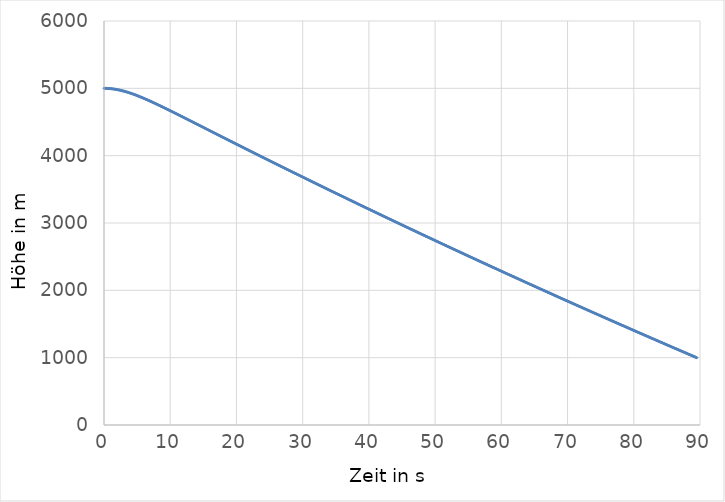
| Category | Series 0 |
|---|---|
| 0.0 | 5000 |
| 0.1 | 4999.951 |
| 0.2 | 4999.804 |
| 0.30000000000000004 | 4999.559 |
| 0.4 | 4999.216 |
| 0.5 | 4998.775 |
| 0.6 | 4998.237 |
| 0.7 | 4997.602 |
| 0.7999999999999999 | 4996.87 |
| 0.8999999999999999 | 4996.043 |
| 0.9999999999999999 | 4995.119 |
| 1.0999999999999999 | 4994.101 |
| 1.2 | 4992.989 |
| 1.3 | 4991.783 |
| 1.4000000000000001 | 4990.484 |
| 1.5000000000000002 | 4989.094 |
| 1.6000000000000003 | 4987.613 |
| 1.7000000000000004 | 4986.042 |
| 1.8000000000000005 | 4984.382 |
| 1.9000000000000006 | 4982.634 |
| 2.0000000000000004 | 4980.8 |
| 2.1000000000000005 | 4978.88 |
| 2.2000000000000006 | 4976.876 |
| 2.3000000000000007 | 4974.788 |
| 2.400000000000001 | 4972.619 |
| 2.500000000000001 | 4970.37 |
| 2.600000000000001 | 4968.041 |
| 2.700000000000001 | 4965.635 |
| 2.800000000000001 | 4963.152 |
| 2.9000000000000012 | 4960.594 |
| 3.0000000000000013 | 4957.962 |
| 3.1000000000000014 | 4955.259 |
| 3.2000000000000015 | 4952.484 |
| 3.3000000000000016 | 4949.641 |
| 3.4000000000000017 | 4946.729 |
| 3.5000000000000018 | 4943.752 |
| 3.600000000000002 | 4940.709 |
| 3.700000000000002 | 4937.604 |
| 3.800000000000002 | 4934.436 |
| 3.900000000000002 | 4931.208 |
| 4.000000000000002 | 4927.921 |
| 4.100000000000001 | 4924.576 |
| 4.200000000000001 | 4921.176 |
| 4.300000000000001 | 4917.721 |
| 4.4 | 4914.213 |
| 4.5 | 4910.652 |
| 4.6 | 4907.042 |
| 4.699999999999999 | 4903.383 |
| 4.799999999999999 | 4899.675 |
| 4.899999999999999 | 4895.922 |
| 4.999999999999998 | 4892.124 |
| 5.099999999999998 | 4888.282 |
| 5.1999999999999975 | 4884.397 |
| 5.299999999999997 | 4880.472 |
| 5.399999999999997 | 4876.506 |
| 5.4999999999999964 | 4872.502 |
| 5.599999999999996 | 4868.461 |
| 5.699999999999996 | 4864.383 |
| 5.799999999999995 | 4860.27 |
| 5.899999999999995 | 4856.122 |
| 5.999999999999995 | 4851.942 |
| 6.099999999999994 | 4847.73 |
| 6.199999999999994 | 4843.487 |
| 6.299999999999994 | 4839.214 |
| 6.399999999999993 | 4834.912 |
| 6.499999999999993 | 4830.583 |
| 6.5999999999999925 | 4826.226 |
| 6.699999999999992 | 4821.844 |
| 6.799999999999992 | 4817.436 |
| 6.8999999999999915 | 4813.004 |
| 6.999999999999991 | 4808.548 |
| 7.099999999999991 | 4804.07 |
| 7.19999999999999 | 4799.571 |
| 7.29999999999999 | 4795.05 |
| 7.39999999999999 | 4790.509 |
| 7.499999999999989 | 4785.948 |
| 7.599999999999989 | 4781.369 |
| 7.699999999999989 | 4776.771 |
| 7.799999999999988 | 4772.157 |
| 7.899999999999988 | 4767.525 |
| 7.999999999999988 | 4762.877 |
| 8.099999999999987 | 4758.214 |
| 8.199999999999987 | 4753.535 |
| 8.299999999999986 | 4748.842 |
| 8.399999999999986 | 4744.136 |
| 8.499999999999986 | 4739.416 |
| 8.599999999999985 | 4734.683 |
| 8.699999999999985 | 4729.938 |
| 8.799999999999985 | 4725.182 |
| 8.899999999999984 | 4720.414 |
| 8.999999999999984 | 4715.635 |
| 9.099999999999984 | 4710.845 |
| 9.199999999999983 | 4706.046 |
| 9.299999999999983 | 4701.237 |
| 9.399999999999983 | 4696.419 |
| 9.499999999999982 | 4691.592 |
| 9.599999999999982 | 4686.757 |
| 9.699999999999982 | 4681.914 |
| 9.799999999999981 | 4677.063 |
| 9.89999999999998 | 4672.204 |
| 9.99999999999998 | 4667.338 |
| 10.09999999999998 | 4662.466 |
| 10.19999999999998 | 4657.587 |
| 10.29999999999998 | 4652.702 |
| 10.399999999999979 | 4647.811 |
| 10.499999999999979 | 4642.915 |
| 10.599999999999978 | 4638.013 |
| 10.699999999999978 | 4633.106 |
| 10.799999999999978 | 4628.194 |
| 10.899999999999977 | 4623.277 |
| 10.999999999999977 | 4618.356 |
| 11.099999999999977 | 4613.431 |
| 11.199999999999976 | 4608.502 |
| 11.299999999999976 | 4603.569 |
| 11.399999999999975 | 4598.632 |
| 11.499999999999975 | 4593.692 |
| 11.599999999999975 | 4588.749 |
| 11.699999999999974 | 4583.802 |
| 11.799999999999974 | 4578.853 |
| 11.899999999999974 | 4573.901 |
| 11.999999999999973 | 4568.946 |
| 12.099999999999973 | 4563.989 |
| 12.199999999999973 | 4559.029 |
| 12.299999999999972 | 4554.068 |
| 12.399999999999972 | 4549.104 |
| 12.499999999999972 | 4544.138 |
| 12.599999999999971 | 4539.171 |
| 12.69999999999997 | 4534.202 |
| 12.79999999999997 | 4529.231 |
| 12.89999999999997 | 4524.259 |
| 12.99999999999997 | 4519.286 |
| 13.09999999999997 | 4514.311 |
| 13.199999999999969 | 4509.335 |
| 13.299999999999969 | 4504.358 |
| 13.399999999999968 | 4499.38 |
| 13.499999999999968 | 4494.401 |
| 13.599999999999968 | 4489.422 |
| 13.699999999999967 | 4484.442 |
| 13.799999999999967 | 4479.461 |
| 13.899999999999967 | 4474.479 |
| 13.999999999999966 | 4469.497 |
| 14.099999999999966 | 4464.515 |
| 14.199999999999966 | 4459.532 |
| 14.299999999999965 | 4454.549 |
| 14.399999999999965 | 4449.565 |
| 14.499999999999964 | 4444.582 |
| 14.599999999999964 | 4439.598 |
| 14.699999999999964 | 4434.614 |
| 14.799999999999963 | 4429.631 |
| 14.899999999999963 | 4424.647 |
| 14.999999999999963 | 4419.663 |
| 15.099999999999962 | 4414.68 |
| 15.199999999999962 | 4409.696 |
| 15.299999999999962 | 4404.713 |
| 15.399999999999961 | 4399.73 |
| 15.499999999999961 | 4394.747 |
| 15.59999999999996 | 4389.765 |
| 15.69999999999996 | 4384.783 |
| 15.79999999999996 | 4379.802 |
| 15.89999999999996 | 4374.82 |
| 15.99999999999996 | 4369.84 |
| 16.09999999999996 | 4364.86 |
| 16.19999999999996 | 4359.88 |
| 16.29999999999996 | 4354.901 |
| 16.399999999999963 | 4349.922 |
| 16.499999999999964 | 4344.944 |
| 16.599999999999966 | 4339.967 |
| 16.699999999999967 | 4334.99 |
| 16.79999999999997 | 4330.015 |
| 16.89999999999997 | 4325.039 |
| 16.99999999999997 | 4320.065 |
| 17.099999999999973 | 4315.091 |
| 17.199999999999974 | 4310.118 |
| 17.299999999999976 | 4305.146 |
| 17.399999999999977 | 4300.174 |
| 17.49999999999998 | 4295.203 |
| 17.59999999999998 | 4290.234 |
| 17.69999999999998 | 4285.265 |
| 17.799999999999983 | 4280.297 |
| 17.899999999999984 | 4275.329 |
| 17.999999999999986 | 4270.363 |
| 18.099999999999987 | 4265.398 |
| 18.19999999999999 | 4260.433 |
| 18.29999999999999 | 4255.47 |
| 18.39999999999999 | 4250.507 |
| 18.499999999999993 | 4245.545 |
| 18.599999999999994 | 4240.585 |
| 18.699999999999996 | 4235.625 |
| 18.799999999999997 | 4230.666 |
| 18.9 | 4225.708 |
| 19.0 | 4220.752 |
| 19.1 | 4215.796 |
| 19.200000000000003 | 4210.841 |
| 19.300000000000004 | 4205.887 |
| 19.400000000000006 | 4200.935 |
| 19.500000000000007 | 4195.983 |
| 19.60000000000001 | 4191.033 |
| 19.70000000000001 | 4186.083 |
| 19.80000000000001 | 4181.135 |
| 19.900000000000013 | 4176.187 |
| 20.000000000000014 | 4171.241 |
| 20.100000000000016 | 4166.296 |
| 20.200000000000017 | 4161.352 |
| 20.30000000000002 | 4156.409 |
| 20.40000000000002 | 4151.467 |
| 20.50000000000002 | 4146.526 |
| 20.600000000000023 | 4141.587 |
| 20.700000000000024 | 4136.648 |
| 20.800000000000026 | 4131.711 |
| 20.900000000000027 | 4126.774 |
| 21.00000000000003 | 4121.839 |
| 21.10000000000003 | 4116.905 |
| 21.20000000000003 | 4111.972 |
| 21.300000000000033 | 4107.04 |
| 21.400000000000034 | 4102.11 |
| 21.500000000000036 | 4097.18 |
| 21.600000000000037 | 4092.252 |
| 21.70000000000004 | 4087.325 |
| 21.80000000000004 | 4082.399 |
| 21.90000000000004 | 4077.474 |
| 22.000000000000043 | 4072.55 |
| 22.100000000000044 | 4067.628 |
| 22.200000000000045 | 4062.706 |
| 22.300000000000047 | 4057.786 |
| 22.40000000000005 | 4052.867 |
| 22.50000000000005 | 4047.949 |
| 22.60000000000005 | 4043.032 |
| 22.700000000000053 | 4038.117 |
| 22.800000000000054 | 4033.202 |
| 22.900000000000055 | 4028.289 |
| 23.000000000000057 | 4023.377 |
| 23.10000000000006 | 4018.466 |
| 23.20000000000006 | 4013.556 |
| 23.30000000000006 | 4008.648 |
| 23.400000000000063 | 4003.74 |
| 23.500000000000064 | 3998.834 |
| 23.600000000000065 | 3993.929 |
| 23.700000000000067 | 3989.026 |
| 23.800000000000068 | 3984.123 |
| 23.90000000000007 | 3979.221 |
| 24.00000000000007 | 3974.321 |
| 24.100000000000072 | 3969.422 |
| 24.200000000000074 | 3964.524 |
| 24.300000000000075 | 3959.628 |
| 24.400000000000077 | 3954.732 |
| 24.500000000000078 | 3949.838 |
| 24.60000000000008 | 3944.945 |
| 24.70000000000008 | 3940.053 |
| 24.800000000000082 | 3935.162 |
| 24.900000000000084 | 3930.272 |
| 25.000000000000085 | 3925.384 |
| 25.100000000000087 | 3920.497 |
| 25.200000000000088 | 3915.611 |
| 25.30000000000009 | 3910.726 |
| 25.40000000000009 | 3905.842 |
| 25.500000000000092 | 3900.96 |
| 25.600000000000094 | 3896.079 |
| 25.700000000000095 | 3891.199 |
| 25.800000000000097 | 3886.32 |
| 25.900000000000098 | 3881.442 |
| 26.0000000000001 | 3876.566 |
| 26.1000000000001 | 3871.69 |
| 26.200000000000102 | 3866.816 |
| 26.300000000000104 | 3861.943 |
| 26.400000000000105 | 3857.072 |
| 26.500000000000107 | 3852.201 |
| 26.600000000000108 | 3847.332 |
| 26.70000000000011 | 3842.464 |
| 26.80000000000011 | 3837.597 |
| 26.900000000000112 | 3832.731 |
| 27.000000000000114 | 3827.866 |
| 27.100000000000115 | 3823.003 |
| 27.200000000000117 | 3818.141 |
| 27.300000000000118 | 3813.28 |
| 27.40000000000012 | 3808.42 |
| 27.50000000000012 | 3803.561 |
| 27.600000000000122 | 3798.704 |
| 27.700000000000124 | 3793.848 |
| 27.800000000000125 | 3788.993 |
| 27.900000000000126 | 3784.139 |
| 28.000000000000128 | 3779.286 |
| 28.10000000000013 | 3774.434 |
| 28.20000000000013 | 3769.584 |
| 28.300000000000132 | 3764.735 |
| 28.400000000000134 | 3759.887 |
| 28.500000000000135 | 3755.04 |
| 28.600000000000136 | 3750.195 |
| 28.700000000000138 | 3745.35 |
| 28.80000000000014 | 3740.507 |
| 28.90000000000014 | 3735.665 |
| 29.000000000000142 | 3730.824 |
| 29.100000000000144 | 3725.984 |
| 29.200000000000145 | 3721.146 |
| 29.300000000000146 | 3716.309 |
| 29.400000000000148 | 3711.472 |
| 29.50000000000015 | 3706.638 |
| 29.60000000000015 | 3701.804 |
| 29.700000000000152 | 3696.971 |
| 29.800000000000153 | 3692.14 |
| 29.900000000000155 | 3687.309 |
| 30.000000000000156 | 3682.48 |
| 30.100000000000158 | 3677.653 |
| 30.20000000000016 | 3672.826 |
| 30.30000000000016 | 3668 |
| 30.400000000000162 | 3663.176 |
| 30.500000000000163 | 3658.353 |
| 30.600000000000165 | 3653.531 |
| 30.700000000000166 | 3648.71 |
| 30.800000000000168 | 3643.89 |
| 30.90000000000017 | 3639.072 |
| 31.00000000000017 | 3634.254 |
| 31.100000000000172 | 3629.438 |
| 31.200000000000173 | 3624.623 |
| 31.300000000000175 | 3619.81 |
| 31.400000000000176 | 3614.997 |
| 31.500000000000178 | 3610.186 |
| 31.60000000000018 | 3605.375 |
| 31.70000000000018 | 3600.566 |
| 31.800000000000182 | 3595.758 |
| 31.900000000000183 | 3590.951 |
| 32.000000000000185 | 3586.146 |
| 32.100000000000186 | 3581.341 |
| 32.20000000000019 | 3576.538 |
| 32.30000000000019 | 3571.736 |
| 32.40000000000019 | 3566.935 |
| 32.50000000000019 | 3562.135 |
| 32.60000000000019 | 3557.337 |
| 32.700000000000195 | 3552.539 |
| 32.800000000000196 | 3547.743 |
| 32.9000000000002 | 3542.948 |
| 33.0000000000002 | 3538.154 |
| 33.1000000000002 | 3533.361 |
| 33.2000000000002 | 3528.569 |
| 33.3000000000002 | 3523.779 |
| 33.400000000000205 | 3518.99 |
| 33.500000000000206 | 3514.201 |
| 33.60000000000021 | 3509.414 |
| 33.70000000000021 | 3504.629 |
| 33.80000000000021 | 3499.844 |
| 33.90000000000021 | 3495.06 |
| 34.00000000000021 | 3490.278 |
| 34.100000000000215 | 3485.497 |
| 34.200000000000216 | 3480.717 |
| 34.30000000000022 | 3475.938 |
| 34.40000000000022 | 3471.16 |
| 34.50000000000022 | 3466.383 |
| 34.60000000000022 | 3461.608 |
| 34.70000000000022 | 3456.834 |
| 34.800000000000225 | 3452.061 |
| 34.900000000000226 | 3447.289 |
| 35.00000000000023 | 3442.518 |
| 35.10000000000023 | 3437.748 |
| 35.20000000000023 | 3432.98 |
| 35.30000000000023 | 3428.212 |
| 35.40000000000023 | 3423.446 |
| 35.500000000000234 | 3418.681 |
| 35.600000000000236 | 3413.917 |
| 35.70000000000024 | 3409.154 |
| 35.80000000000024 | 3404.393 |
| 35.90000000000024 | 3399.632 |
| 36.00000000000024 | 3394.873 |
| 36.10000000000024 | 3390.115 |
| 36.200000000000244 | 3385.358 |
| 36.300000000000246 | 3380.602 |
| 36.40000000000025 | 3375.847 |
| 36.50000000000025 | 3371.093 |
| 36.60000000000025 | 3366.341 |
| 36.70000000000025 | 3361.589 |
| 36.80000000000025 | 3356.839 |
| 36.900000000000254 | 3352.09 |
| 37.000000000000256 | 3347.342 |
| 37.10000000000026 | 3342.595 |
| 37.20000000000026 | 3337.85 |
| 37.30000000000026 | 3333.105 |
| 37.40000000000026 | 3328.362 |
| 37.50000000000026 | 3323.62 |
| 37.600000000000264 | 3318.879 |
| 37.700000000000266 | 3314.139 |
| 37.80000000000027 | 3309.4 |
| 37.90000000000027 | 3304.662 |
| 38.00000000000027 | 3299.926 |
| 38.10000000000027 | 3295.19 |
| 38.20000000000027 | 3290.456 |
| 38.300000000000274 | 3285.723 |
| 38.400000000000276 | 3280.991 |
| 38.50000000000028 | 3276.26 |
| 38.60000000000028 | 3271.53 |
| 38.70000000000028 | 3266.802 |
| 38.80000000000028 | 3262.074 |
| 38.90000000000028 | 3257.348 |
| 39.000000000000284 | 3252.623 |
| 39.100000000000286 | 3247.899 |
| 39.20000000000029 | 3243.176 |
| 39.30000000000029 | 3238.454 |
| 39.40000000000029 | 3233.733 |
| 39.50000000000029 | 3229.013 |
| 39.60000000000029 | 3224.295 |
| 39.700000000000294 | 3219.578 |
| 39.800000000000296 | 3214.862 |
| 39.9000000000003 | 3210.146 |
| 40.0000000000003 | 3205.432 |
| 40.1000000000003 | 3200.72 |
| 40.2000000000003 | 3196.008 |
| 40.3000000000003 | 3191.297 |
| 40.400000000000304 | 3186.588 |
| 40.500000000000306 | 3181.88 |
| 40.60000000000031 | 3177.172 |
| 40.70000000000031 | 3172.466 |
| 40.80000000000031 | 3167.761 |
| 40.90000000000031 | 3163.057 |
| 41.00000000000031 | 3158.355 |
| 41.100000000000314 | 3153.653 |
| 41.200000000000315 | 3148.953 |
| 41.30000000000032 | 3144.253 |
| 41.40000000000032 | 3139.555 |
| 41.50000000000032 | 3134.858 |
| 41.60000000000032 | 3130.162 |
| 41.70000000000032 | 3125.467 |
| 41.800000000000324 | 3120.773 |
| 41.900000000000325 | 3116.08 |
| 42.00000000000033 | 3111.389 |
| 42.10000000000033 | 3106.698 |
| 42.20000000000033 | 3102.009 |
| 42.30000000000033 | 3097.321 |
| 42.40000000000033 | 3092.633 |
| 42.500000000000334 | 3087.947 |
| 42.600000000000335 | 3083.263 |
| 42.70000000000034 | 3078.579 |
| 42.80000000000034 | 3073.896 |
| 42.90000000000034 | 3069.214 |
| 43.00000000000034 | 3064.534 |
| 43.10000000000034 | 3059.855 |
| 43.200000000000344 | 3055.176 |
| 43.300000000000345 | 3050.499 |
| 43.40000000000035 | 3045.823 |
| 43.50000000000035 | 3041.148 |
| 43.60000000000035 | 3036.474 |
| 43.70000000000035 | 3031.802 |
| 43.80000000000035 | 3027.13 |
| 43.900000000000354 | 3022.46 |
| 44.000000000000355 | 3017.79 |
| 44.10000000000036 | 3013.122 |
| 44.20000000000036 | 3008.455 |
| 44.30000000000036 | 3003.788 |
| 44.40000000000036 | 2999.123 |
| 44.50000000000036 | 2994.459 |
| 44.600000000000364 | 2989.797 |
| 44.700000000000365 | 2985.135 |
| 44.80000000000037 | 2980.474 |
| 44.90000000000037 | 2975.815 |
| 45.00000000000037 | 2971.156 |
| 45.10000000000037 | 2966.499 |
| 45.20000000000037 | 2961.843 |
| 45.300000000000374 | 2957.188 |
| 45.400000000000375 | 2952.534 |
| 45.50000000000038 | 2947.881 |
| 45.60000000000038 | 2943.229 |
| 45.70000000000038 | 2938.578 |
| 45.80000000000038 | 2933.928 |
| 45.90000000000038 | 2929.28 |
| 46.000000000000384 | 2924.632 |
| 46.100000000000385 | 2919.986 |
| 46.20000000000039 | 2915.341 |
| 46.30000000000039 | 2910.697 |
| 46.40000000000039 | 2906.053 |
| 46.50000000000039 | 2901.411 |
| 46.60000000000039 | 2896.77 |
| 46.700000000000394 | 2892.131 |
| 46.800000000000395 | 2887.492 |
| 46.9000000000004 | 2882.854 |
| 47.0000000000004 | 2878.218 |
| 47.1000000000004 | 2873.582 |
| 47.2000000000004 | 2868.948 |
| 47.3000000000004 | 2864.314 |
| 47.400000000000404 | 2859.682 |
| 47.500000000000405 | 2855.051 |
| 47.600000000000406 | 2850.421 |
| 47.70000000000041 | 2845.792 |
| 47.80000000000041 | 2841.164 |
| 47.90000000000041 | 2836.537 |
| 48.00000000000041 | 2831.911 |
| 48.10000000000041 | 2827.287 |
| 48.200000000000415 | 2822.663 |
| 48.300000000000416 | 2818.041 |
| 48.40000000000042 | 2813.419 |
| 48.50000000000042 | 2808.799 |
| 48.60000000000042 | 2804.18 |
| 48.70000000000042 | 2799.562 |
| 48.80000000000042 | 2794.944 |
| 48.900000000000425 | 2790.328 |
| 49.000000000000426 | 2785.713 |
| 49.10000000000043 | 2781.1 |
| 49.20000000000043 | 2776.487 |
| 49.30000000000043 | 2771.875 |
| 49.40000000000043 | 2767.264 |
| 49.50000000000043 | 2762.655 |
| 49.600000000000435 | 2758.046 |
| 49.700000000000436 | 2753.439 |
| 49.80000000000044 | 2748.833 |
| 49.90000000000044 | 2744.227 |
| 50.00000000000044 | 2739.623 |
| 50.10000000000044 | 2735.02 |
| 50.20000000000044 | 2730.418 |
| 50.300000000000445 | 2725.817 |
| 50.400000000000446 | 2721.217 |
| 50.50000000000045 | 2716.618 |
| 50.60000000000045 | 2712.02 |
| 50.70000000000045 | 2707.424 |
| 50.80000000000045 | 2702.828 |
| 50.90000000000045 | 2698.233 |
| 51.000000000000455 | 2693.64 |
| 51.100000000000456 | 2689.047 |
| 51.20000000000046 | 2684.456 |
| 51.30000000000046 | 2679.866 |
| 51.40000000000046 | 2675.277 |
| 51.50000000000046 | 2670.688 |
| 51.60000000000046 | 2666.101 |
| 51.700000000000465 | 2661.515 |
| 51.800000000000466 | 2656.93 |
| 51.90000000000047 | 2652.346 |
| 52.00000000000047 | 2647.763 |
| 52.10000000000047 | 2643.182 |
| 52.20000000000047 | 2638.601 |
| 52.30000000000047 | 2634.021 |
| 52.400000000000475 | 2629.442 |
| 52.500000000000476 | 2624.865 |
| 52.60000000000048 | 2620.288 |
| 52.70000000000048 | 2615.713 |
| 52.80000000000048 | 2611.139 |
| 52.90000000000048 | 2606.565 |
| 53.00000000000048 | 2601.993 |
| 53.100000000000485 | 2597.422 |
| 53.200000000000486 | 2592.852 |
| 53.30000000000049 | 2588.282 |
| 53.40000000000049 | 2583.714 |
| 53.50000000000049 | 2579.147 |
| 53.60000000000049 | 2574.581 |
| 53.70000000000049 | 2570.017 |
| 53.800000000000495 | 2565.453 |
| 53.900000000000496 | 2560.89 |
| 54.0000000000005 | 2556.328 |
| 54.1000000000005 | 2551.767 |
| 54.2000000000005 | 2547.208 |
| 54.3000000000005 | 2542.649 |
| 54.4000000000005 | 2538.092 |
| 54.500000000000504 | 2533.535 |
| 54.600000000000506 | 2528.98 |
| 54.70000000000051 | 2524.425 |
| 54.80000000000051 | 2519.872 |
| 54.90000000000051 | 2515.32 |
| 55.00000000000051 | 2510.769 |
| 55.10000000000051 | 2506.218 |
| 55.200000000000514 | 2501.669 |
| 55.300000000000516 | 2497.121 |
| 55.40000000000052 | 2492.574 |
| 55.50000000000052 | 2488.028 |
| 55.60000000000052 | 2483.483 |
| 55.70000000000052 | 2478.939 |
| 55.80000000000052 | 2474.396 |
| 55.900000000000524 | 2469.854 |
| 56.000000000000526 | 2465.314 |
| 56.10000000000053 | 2460.774 |
| 56.20000000000053 | 2456.235 |
| 56.30000000000053 | 2451.697 |
| 56.40000000000053 | 2447.161 |
| 56.50000000000053 | 2442.625 |
| 56.600000000000534 | 2438.091 |
| 56.700000000000536 | 2433.557 |
| 56.80000000000054 | 2429.025 |
| 56.90000000000054 | 2424.493 |
| 57.00000000000054 | 2419.963 |
| 57.10000000000054 | 2415.433 |
| 57.20000000000054 | 2410.905 |
| 57.300000000000544 | 2406.378 |
| 57.400000000000546 | 2401.851 |
| 57.50000000000055 | 2397.326 |
| 57.60000000000055 | 2392.802 |
| 57.70000000000055 | 2388.279 |
| 57.80000000000055 | 2383.757 |
| 57.90000000000055 | 2379.236 |
| 58.000000000000554 | 2374.716 |
| 58.100000000000556 | 2370.197 |
| 58.20000000000056 | 2365.679 |
| 58.30000000000056 | 2361.162 |
| 58.40000000000056 | 2356.646 |
| 58.50000000000056 | 2352.131 |
| 58.60000000000056 | 2347.617 |
| 58.700000000000564 | 2343.104 |
| 58.800000000000566 | 2338.592 |
| 58.90000000000057 | 2334.082 |
| 59.00000000000057 | 2329.572 |
| 59.10000000000057 | 2325.063 |
| 59.20000000000057 | 2320.555 |
| 59.30000000000057 | 2316.049 |
| 59.400000000000574 | 2311.543 |
| 59.500000000000576 | 2307.038 |
| 59.60000000000058 | 2302.535 |
| 59.70000000000058 | 2298.032 |
| 59.80000000000058 | 2293.531 |
| 59.90000000000058 | 2289.03 |
| 60.00000000000058 | 2284.531 |
| 60.100000000000584 | 2280.032 |
| 60.200000000000585 | 2275.535 |
| 60.30000000000059 | 2271.038 |
| 60.40000000000059 | 2266.543 |
| 60.50000000000059 | 2262.048 |
| 60.60000000000059 | 2257.555 |
| 60.70000000000059 | 2253.063 |
| 60.800000000000594 | 2248.571 |
| 60.900000000000595 | 2244.081 |
| 61.0000000000006 | 2239.592 |
| 61.1000000000006 | 2235.103 |
| 61.2000000000006 | 2230.616 |
| 61.3000000000006 | 2226.13 |
| 61.4000000000006 | 2221.645 |
| 61.500000000000604 | 2217.161 |
| 61.600000000000605 | 2212.677 |
| 61.70000000000061 | 2208.195 |
| 61.80000000000061 | 2203.714 |
| 61.90000000000061 | 2199.234 |
| 62.00000000000061 | 2194.755 |
| 62.10000000000061 | 2190.277 |
| 62.200000000000614 | 2185.799 |
| 62.300000000000615 | 2181.323 |
| 62.40000000000062 | 2176.848 |
| 62.50000000000062 | 2172.374 |
| 62.60000000000062 | 2167.901 |
| 62.70000000000062 | 2163.429 |
| 62.80000000000062 | 2158.958 |
| 62.900000000000624 | 2154.488 |
| 63.000000000000625 | 2150.019 |
| 63.10000000000063 | 2145.551 |
| 63.20000000000063 | 2141.084 |
| 63.30000000000063 | 2136.618 |
| 63.40000000000063 | 2132.153 |
| 63.50000000000063 | 2127.689 |
| 63.600000000000634 | 2123.226 |
| 63.700000000000635 | 2118.764 |
| 63.80000000000064 | 2114.303 |
| 63.90000000000064 | 2109.843 |
| 64.00000000000064 | 2105.384 |
| 64.10000000000063 | 2100.926 |
| 64.20000000000063 | 2096.469 |
| 64.30000000000062 | 2092.013 |
| 64.40000000000062 | 2087.558 |
| 64.50000000000061 | 2083.104 |
| 64.6000000000006 | 2078.651 |
| 64.7000000000006 | 2074.199 |
| 64.8000000000006 | 2069.749 |
| 64.90000000000059 | 2065.299 |
| 65.00000000000058 | 2060.85 |
| 65.10000000000058 | 2056.402 |
| 65.20000000000057 | 2051.955 |
| 65.30000000000057 | 2047.509 |
| 65.40000000000056 | 2043.064 |
| 65.50000000000055 | 2038.62 |
| 65.60000000000055 | 2034.177 |
| 65.70000000000054 | 2029.735 |
| 65.80000000000054 | 2025.294 |
| 65.90000000000053 | 2020.854 |
| 66.00000000000053 | 2016.415 |
| 66.10000000000052 | 2011.977 |
| 66.20000000000051 | 2007.54 |
| 66.30000000000051 | 2003.104 |
| 66.4000000000005 | 1998.669 |
| 66.5000000000005 | 1994.235 |
| 66.60000000000049 | 1989.802 |
| 66.70000000000049 | 1985.37 |
| 66.80000000000048 | 1980.939 |
| 66.90000000000047 | 1976.509 |
| 67.00000000000047 | 1972.08 |
| 67.10000000000046 | 1967.652 |
| 67.20000000000046 | 1963.225 |
| 67.30000000000045 | 1958.799 |
| 67.40000000000045 | 1954.374 |
| 67.50000000000044 | 1949.95 |
| 67.60000000000043 | 1945.527 |
| 67.70000000000043 | 1941.105 |
| 67.80000000000042 | 1936.684 |
| 67.90000000000042 | 1932.263 |
| 68.00000000000041 | 1927.844 |
| 68.1000000000004 | 1923.426 |
| 68.2000000000004 | 1919.009 |
| 68.3000000000004 | 1914.593 |
| 68.40000000000039 | 1910.178 |
| 68.50000000000038 | 1905.763 |
| 68.60000000000038 | 1901.35 |
| 68.70000000000037 | 1896.938 |
| 68.80000000000037 | 1892.527 |
| 68.90000000000036 | 1888.116 |
| 69.00000000000036 | 1883.707 |
| 69.10000000000035 | 1879.299 |
| 69.20000000000034 | 1874.891 |
| 69.30000000000034 | 1870.485 |
| 69.40000000000033 | 1866.08 |
| 69.50000000000033 | 1861.675 |
| 69.60000000000032 | 1857.272 |
| 69.70000000000032 | 1852.869 |
| 69.80000000000031 | 1848.468 |
| 69.9000000000003 | 1844.067 |
| 70.0000000000003 | 1839.668 |
| 70.10000000000029 | 1835.269 |
| 70.20000000000029 | 1830.872 |
| 70.30000000000028 | 1826.475 |
| 70.40000000000028 | 1822.08 |
| 70.50000000000027 | 1817.685 |
| 70.60000000000026 | 1813.291 |
| 70.70000000000026 | 1808.899 |
| 70.80000000000025 | 1804.507 |
| 70.90000000000025 | 1800.116 |
| 71.00000000000024 | 1795.727 |
| 71.10000000000024 | 1791.338 |
| 71.20000000000023 | 1786.95 |
| 71.30000000000022 | 1782.563 |
| 71.40000000000022 | 1778.177 |
| 71.50000000000021 | 1773.792 |
| 71.60000000000021 | 1769.408 |
| 71.7000000000002 | 1765.025 |
| 71.8000000000002 | 1760.643 |
| 71.90000000000019 | 1756.262 |
| 72.00000000000018 | 1751.882 |
| 72.10000000000018 | 1747.503 |
| 72.20000000000017 | 1743.125 |
| 72.30000000000017 | 1738.748 |
| 72.40000000000016 | 1734.372 |
| 72.50000000000016 | 1729.997 |
| 72.60000000000015 | 1725.622 |
| 72.70000000000014 | 1721.249 |
| 72.80000000000014 | 1716.877 |
| 72.90000000000013 | 1712.506 |
| 73.00000000000013 | 1708.135 |
| 73.10000000000012 | 1703.766 |
| 73.20000000000012 | 1699.397 |
| 73.30000000000011 | 1695.03 |
| 73.4000000000001 | 1690.663 |
| 73.5000000000001 | 1686.298 |
| 73.6000000000001 | 1681.933 |
| 73.70000000000009 | 1677.57 |
| 73.80000000000008 | 1673.207 |
| 73.90000000000008 | 1668.845 |
| 74.00000000000007 | 1664.484 |
| 74.10000000000007 | 1660.125 |
| 74.20000000000006 | 1655.766 |
| 74.30000000000005 | 1651.408 |
| 74.40000000000005 | 1647.051 |
| 74.50000000000004 | 1642.695 |
| 74.60000000000004 | 1638.34 |
| 74.70000000000003 | 1633.986 |
| 74.80000000000003 | 1629.633 |
| 74.90000000000002 | 1625.281 |
| 75.00000000000001 | 1620.93 |
| 75.10000000000001 | 1616.579 |
| 75.2 | 1612.23 |
| 75.3 | 1607.882 |
| 75.39999999999999 | 1603.534 |
| 75.49999999999999 | 1599.188 |
| 75.59999999999998 | 1594.843 |
| 75.69999999999997 | 1590.498 |
| 75.79999999999997 | 1586.155 |
| 75.89999999999996 | 1581.812 |
| 75.99999999999996 | 1577.47 |
| 76.09999999999995 | 1573.13 |
| 76.19999999999995 | 1568.79 |
| 76.29999999999994 | 1564.451 |
| 76.39999999999993 | 1560.113 |
| 76.49999999999993 | 1555.776 |
| 76.59999999999992 | 1551.441 |
| 76.69999999999992 | 1547.106 |
| 76.79999999999991 | 1542.771 |
| 76.8999999999999 | 1538.438 |
| 76.9999999999999 | 1534.106 |
| 77.0999999999999 | 1529.775 |
| 77.19999999999989 | 1525.445 |
| 77.29999999999988 | 1521.116 |
| 77.39999999999988 | 1516.787 |
| 77.49999999999987 | 1512.46 |
| 77.59999999999987 | 1508.133 |
| 77.69999999999986 | 1503.808 |
| 77.79999999999986 | 1499.483 |
| 77.89999999999985 | 1495.16 |
| 77.99999999999984 | 1490.837 |
| 78.09999999999984 | 1486.515 |
| 78.19999999999983 | 1482.194 |
| 78.29999999999983 | 1477.875 |
| 78.39999999999982 | 1473.556 |
| 78.49999999999982 | 1469.238 |
| 78.59999999999981 | 1464.921 |
| 78.6999999999998 | 1460.605 |
| 78.7999999999998 | 1456.289 |
| 78.89999999999979 | 1451.975 |
| 78.99999999999979 | 1447.662 |
| 79.09999999999978 | 1443.35 |
| 79.19999999999978 | 1439.038 |
| 79.29999999999977 | 1434.728 |
| 79.39999999999976 | 1430.418 |
| 79.49999999999976 | 1426.11 |
| 79.59999999999975 | 1421.802 |
| 79.69999999999975 | 1417.495 |
| 79.79999999999974 | 1413.189 |
| 79.89999999999974 | 1408.885 |
| 79.99999999999973 | 1404.581 |
| 80.09999999999972 | 1400.278 |
| 80.19999999999972 | 1395.976 |
| 80.29999999999971 | 1391.675 |
| 80.39999999999971 | 1387.374 |
| 80.4999999999997 | 1383.075 |
| 80.5999999999997 | 1378.777 |
| 80.69999999999969 | 1374.48 |
| 80.79999999999968 | 1370.183 |
| 80.89999999999968 | 1365.888 |
| 80.99999999999967 | 1361.593 |
| 81.09999999999967 | 1357.299 |
| 81.19999999999966 | 1353.007 |
| 81.29999999999966 | 1348.715 |
| 81.39999999999965 | 1344.424 |
| 81.49999999999964 | 1340.134 |
| 81.59999999999964 | 1335.845 |
| 81.69999999999963 | 1331.557 |
| 81.79999999999963 | 1327.27 |
| 81.89999999999962 | 1322.984 |
| 81.99999999999962 | 1318.699 |
| 82.09999999999961 | 1314.414 |
| 82.1999999999996 | 1310.131 |
| 82.2999999999996 | 1305.848 |
| 82.3999999999996 | 1301.567 |
| 82.49999999999959 | 1297.286 |
| 82.59999999999958 | 1293.006 |
| 82.69999999999958 | 1288.727 |
| 82.79999999999957 | 1284.45 |
| 82.89999999999957 | 1280.173 |
| 82.99999999999956 | 1275.897 |
| 83.09999999999955 | 1271.622 |
| 83.19999999999955 | 1267.347 |
| 83.29999999999954 | 1263.074 |
| 83.39999999999954 | 1258.802 |
| 83.49999999999953 | 1254.53 |
| 83.59999999999953 | 1250.26 |
| 83.69999999999952 | 1245.99 |
| 83.79999999999951 | 1241.722 |
| 83.89999999999951 | 1237.454 |
| 83.9999999999995 | 1233.187 |
| 84.0999999999995 | 1228.921 |
| 84.19999999999949 | 1224.656 |
| 84.29999999999949 | 1220.392 |
| 84.39999999999948 | 1216.129 |
| 84.49999999999947 | 1211.867 |
| 84.59999999999947 | 1207.605 |
| 84.69999999999946 | 1203.345 |
| 84.79999999999946 | 1199.085 |
| 84.89999999999945 | 1194.827 |
| 84.99999999999945 | 1190.569 |
| 85.09999999999944 | 1186.313 |
| 85.19999999999943 | 1182.057 |
| 85.29999999999943 | 1177.802 |
| 85.39999999999942 | 1173.548 |
| 85.49999999999942 | 1169.295 |
| 85.59999999999941 | 1165.043 |
| 85.6999999999994 | 1160.791 |
| 85.7999999999994 | 1156.541 |
| 85.8999999999994 | 1152.291 |
| 85.99999999999939 | 1148.043 |
| 86.09999999999938 | 1143.795 |
| 86.19999999999938 | 1139.549 |
| 86.29999999999937 | 1135.303 |
| 86.39999999999937 | 1131.058 |
| 86.49999999999936 | 1126.814 |
| 86.59999999999935 | 1122.571 |
| 86.69999999999935 | 1118.329 |
| 86.79999999999934 | 1114.088 |
| 86.89999999999934 | 1109.847 |
| 86.99999999999933 | 1105.608 |
| 87.09999999999933 | 1101.369 |
| 87.19999999999932 | 1097.132 |
| 87.29999999999932 | 1092.895 |
| 87.39999999999931 | 1088.659 |
| 87.4999999999993 | 1084.424 |
| 87.5999999999993 | 1080.19 |
| 87.69999999999929 | 1075.957 |
| 87.79999999999929 | 1071.725 |
| 87.89999999999928 | 1067.494 |
| 87.99999999999928 | 1063.263 |
| 88.09999999999927 | 1059.034 |
| 88.19999999999926 | 1054.805 |
| 88.29999999999926 | 1050.577 |
| 88.39999999999925 | 1046.351 |
| 88.49999999999925 | 1042.125 |
| 88.59999999999924 | 1037.9 |
| 88.69999999999924 | 1033.676 |
| 88.79999999999923 | 1029.453 |
| 88.89999999999922 | 1025.23 |
| 88.99999999999922 | 1021.009 |
| 89.09999999999921 | 1016.789 |
| 89.1999999999992 | 1012.569 |
| 89.2999999999992 | 1008.35 |
| 89.3999999999992 | 1004.133 |
| 89.49999999999919 | 999.916 |